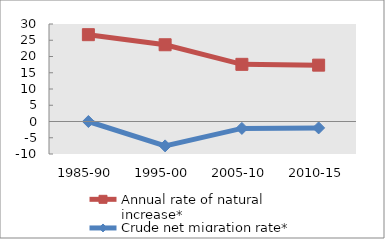
| Category | Annual rate of natural increase* | Crude net migration rate* |
|---|---|---|
| 1985-90 | 26.715 | 0 |
| 1995-00 | 23.613 | -7.504 |
| 2005-10 | 17.587 | -2.125 |
| 2010-15 | 17.338 | -1.968 |